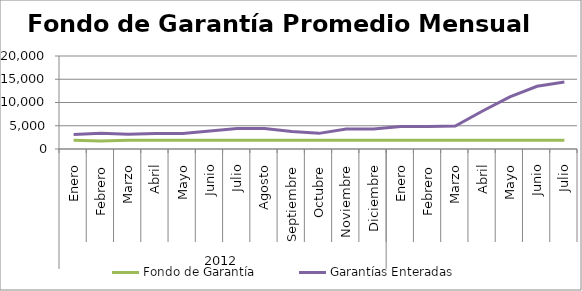
| Category | Fondo de Garantía | Garantías Enteradas |
|---|---|---|
| 0 | 1896.798 | 3141.641 |
| 1 | 1714.423 | 3362.648 |
| 2 | 1900.513 | 3154.118 |
| 3 | 1900.513 | 3348.058 |
| 4 | 1898.685 | 3308.859 |
| 5 | 1900.513 | 3850.375 |
| 6 | 1900.513 | 4400.539 |
| 7 | 1895.388 | 4383.327 |
| 8 | 1900.513 | 3757.632 |
| 9 | 1900.513 | 3362.932 |
| 10 | 1900.311 | 4285.609 |
| 11 | 1890.98 | 4296.87 |
| 12 | 1898.667 | 4842.786 |
| 13 | 1900.512 | 4845.136 |
| 14 | 1900.513 | 4938.365 |
| 15 | 1900.513 | 8179.666 |
| 16 | 1900.513 | 11202.213 |
| 17 | 1900.513 | 13493.433 |
| 18 | 1900.513 | 14387.844 |